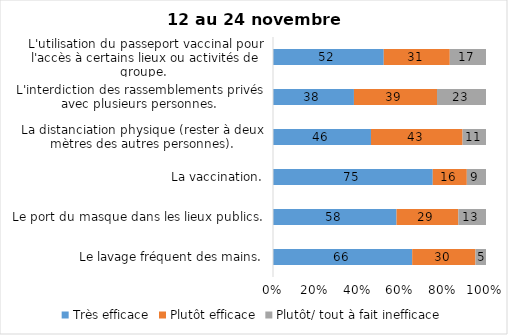
| Category | Très efficace | Plutôt efficace | Plutôt/ tout à fait inefficace |
|---|---|---|---|
| Le lavage fréquent des mains. | 66 | 30 | 5 |
| Le port du masque dans les lieux publics. | 58 | 29 | 13 |
| La vaccination. | 75 | 16 | 9 |
| La distanciation physique (rester à deux mètres des autres personnes). | 46 | 43 | 11 |
| L'interdiction des rassemblements privés avec plusieurs personnes. | 38 | 39 | 23 |
| L'utilisation du passeport vaccinal pour l'accès à certains lieux ou activités de groupe.  | 52 | 31 | 17 |